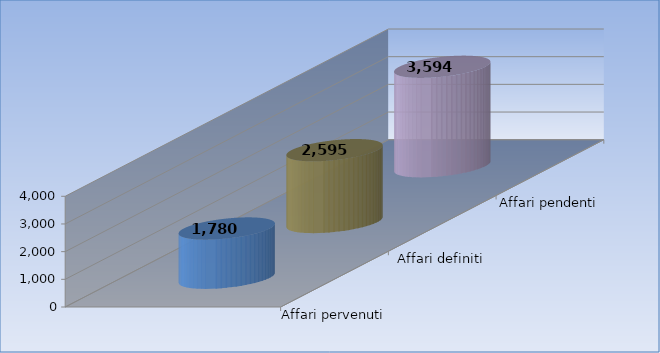
| Category | Affari pervenuti | Affari definiti | Affari pendenti |
|---|---|---|---|
| 0 | 1780 | 2595 | 3594 |